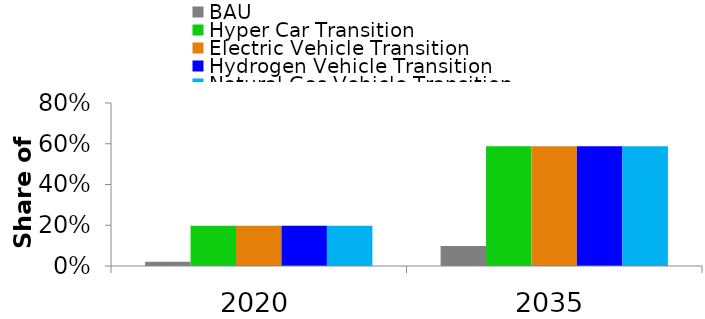
| Category | BAU | Hyper Car Transition | Electric Vehicle Transition | Hydrogen Vehicle Transition | Natural Gas Vehicle Transition |
|---|---|---|---|---|---|
| 2020.0 | 0.021 | 0.198 | 0.198 | 0.198 | 0.198 |
| 2035.0 | 0.098 | 0.588 | 0.588 | 0.588 | 0.588 |